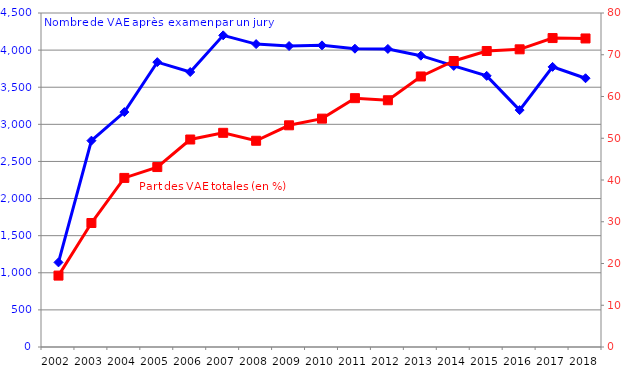
| Category | Nombre de VAE après examen par un jury |
|---|---|
| 2002.0 | 1140 |
| 2003.0 | 2780 |
| 2004.0 | 3165 |
| 2005.0 | 3838 |
| 2006.0 | 3705 |
| 2007.0 | 4199 |
| 2008.0 | 4081 |
| 2009.0 | 4055 |
| 2010.0 | 4064 |
| 2011.0 | 4019 |
| 2012.0 | 4016 |
| 2013.0 | 3925 |
| 2014.0 | 3787 |
| 2015.0 | 3653 |
| 2016.0 | 3192 |
| 2017.0 | 3774 |
| 2018.0 | 3621 |